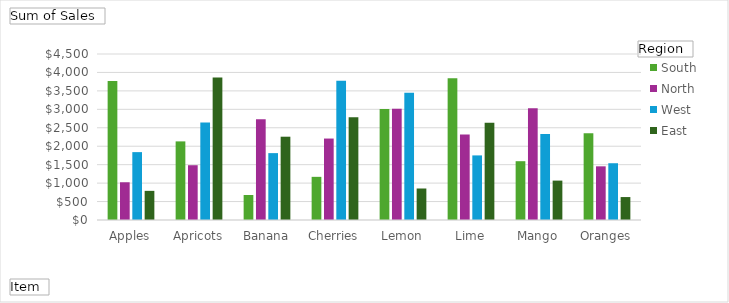
| Category | South | North | West | East |
|---|---|---|---|---|
| Apples | 3767 | 1023 | 1840 | 790 |
| Apricots | 2131 | 1485 | 2643 | 3860 |
| Banana | 678 | 2731 | 1813 | 2258 |
| Cherries | 1170 | 2208 | 3777 | 2784 |
| Lemon | 3011 | 3015 | 3447 | 854 |
| Lime | 3841 | 2318 | 1751 | 2635 |
| Mango | 1594 | 3032 | 2330 | 1068 |
| Oranges | 2354 | 1455 | 1539 | 622 |